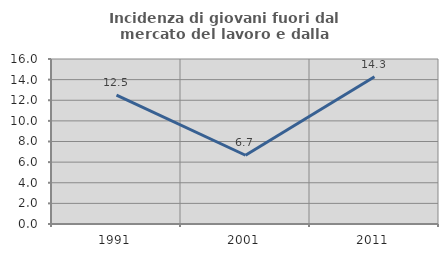
| Category | Incidenza di giovani fuori dal mercato del lavoro e dalla formazione  |
|---|---|
| 1991.0 | 12.5 |
| 2001.0 | 6.667 |
| 2011.0 | 14.286 |